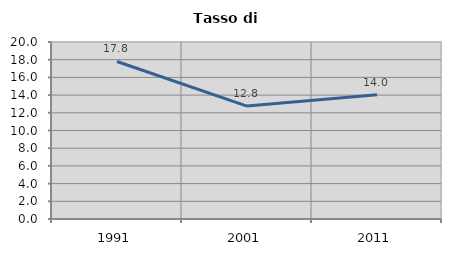
| Category | Tasso di disoccupazione   |
|---|---|
| 1991.0 | 17.797 |
| 2001.0 | 12.76 |
| 2011.0 | 14.026 |